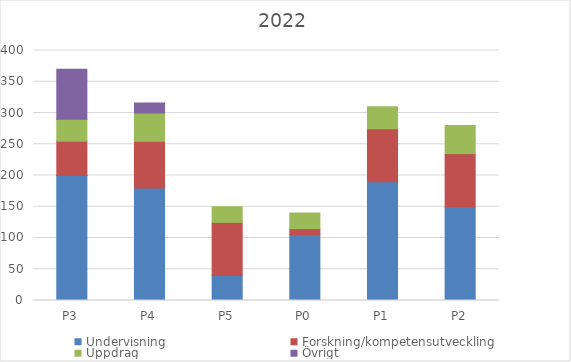
| Category | Undervisning | Forskning/kompetensutveckling | Uppdrag | Övrigt |
|---|---|---|---|---|
| P3 | 200 | 55 | 35 | 80 |
| P4 | 180 | 75 | 45 | 16 |
| P5 | 40 | 85 | 25 | 0 |
| P0 | 105 | 10 | 25 | 0 |
| P1 | 190 | 85 | 35 | 0 |
| P2 | 150 | 85 | 45 | 0 |